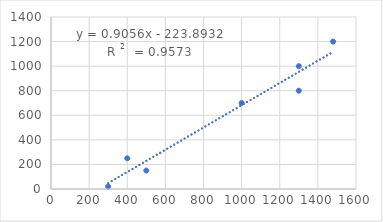
| Category | Series 0 |
|---|---|
| 1480.0 | 1200 |
| 500.0 | 150 |
| 300.0 | 20 |
| 400.0 | 250 |
| 1300.0 | 1000 |
| 1000.0 | 700 |
| 1300.0 | 800 |